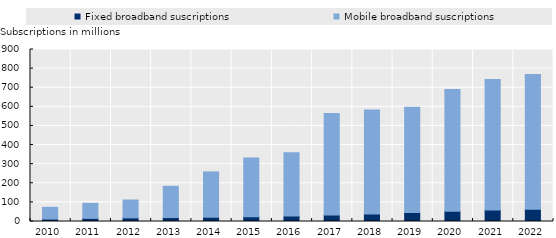
| Category | Fixed broadband suscriptions | Mobile broadband suscriptions |
|---|---|---|
| 2010.0 | 12717000 | 61478400 |
| 2011.0 | 16239000 | 78763000 |
| 2012.0 | 18855000 | 93611200 |
| 2013.0 | 20655000 | 163546200 |
| 2014.0 | 22380000 | 237211700 |
| 2015.0 | 25483400 | 307336600 |
| 2016.0 | 28961300 | 330611400 |
| 2017.0 | 33574000 | 531203000 |
| 2018.0 | 39422000 | 543950000 |
| 2019.0 | 46771000 | 551075400 |
| 2020.0 | 53829000 | 636248500 |
| 2021.0 | 60506000 | 683000400 |
| 2022.0 | 64323000 | 704714350 |